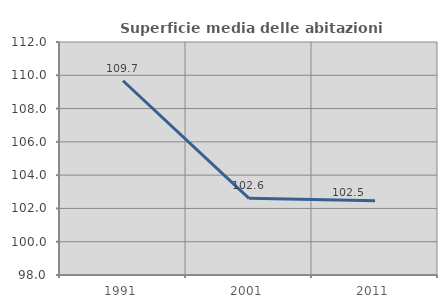
| Category | Superficie media delle abitazioni occupate |
|---|---|
| 1991.0 | 109.673 |
| 2001.0 | 102.607 |
| 2011.0 | 102.468 |